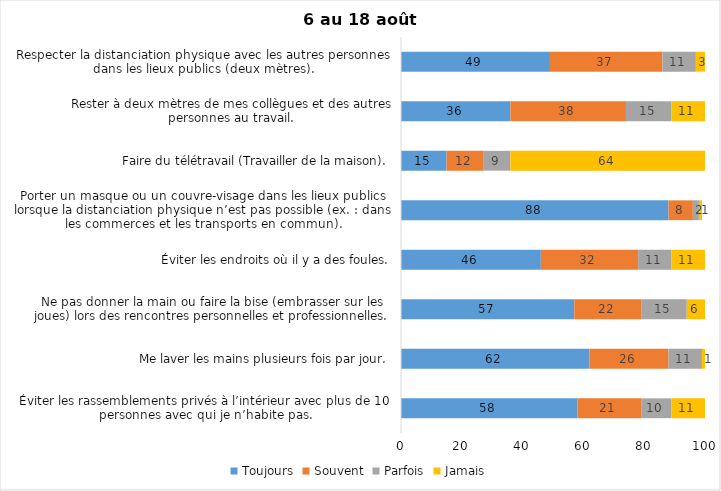
| Category | Toujours | Souvent | Parfois | Jamais |
|---|---|---|---|---|
| Éviter les rassemblements privés à l’intérieur avec plus de 10 personnes avec qui je n’habite pas. | 58 | 21 | 10 | 11 |
| Me laver les mains plusieurs fois par jour. | 62 | 26 | 11 | 1 |
| Ne pas donner la main ou faire la bise (embrasser sur les joues) lors des rencontres personnelles et professionnelles. | 57 | 22 | 15 | 6 |
| Éviter les endroits où il y a des foules. | 46 | 32 | 11 | 11 |
| Porter un masque ou un couvre-visage dans les lieux publics lorsque la distanciation physique n’est pas possible (ex. : dans les commerces et les transports en commun). | 88 | 8 | 2 | 1 |
| Faire du télétravail (Travailler de la maison). | 15 | 12 | 9 | 64 |
| Rester à deux mètres de mes collègues et des autres personnes au travail. | 36 | 38 | 15 | 11 |
| Respecter la distanciation physique avec les autres personnes dans les lieux publics (deux mètres). | 49 | 37 | 11 | 3 |